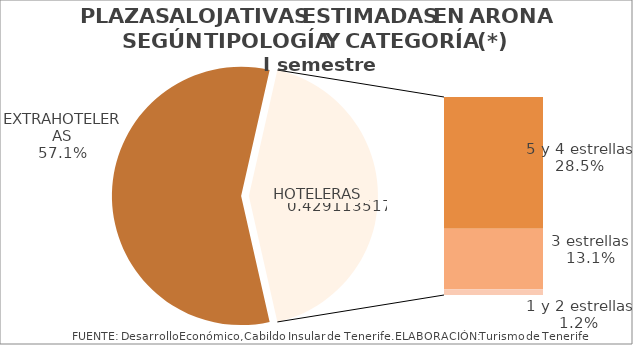
| Category | I semestre 2014 |
|---|---|
| EXTRAHOTELERAS | 0.571 |
| 5 y 4 estrellas | 0.285 |
| 3 estrellas | 0.131 |
| 1 y 2 estrellas | 0.012 |